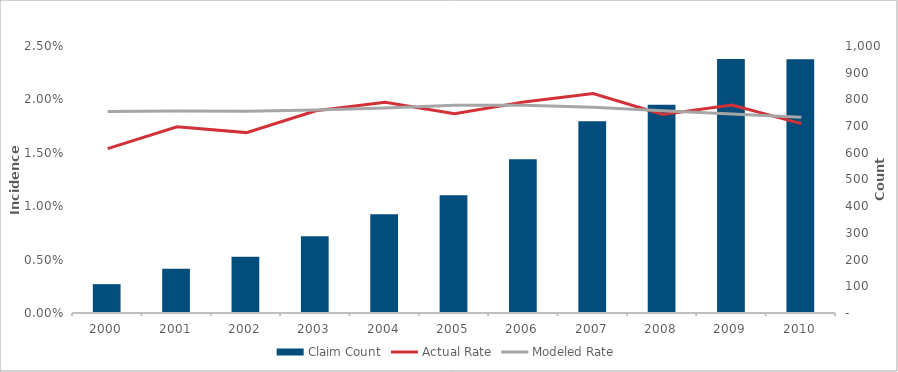
| Category | Claim Count |
|---|---|
| 2000.0 | 108 |
| 2001.0 | 166 |
| 2002.0 | 211 |
| 2003.0 | 287 |
| 2004.0 | 370 |
| 2005.0 | 441 |
| 2006.0 | 576 |
| 2007.0 | 718 |
| 2008.0 | 780 |
| 2009.0 | 951 |
| 2010.0 | 950 |